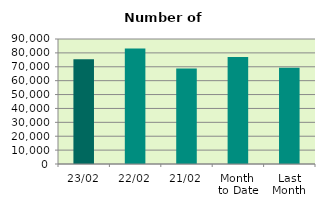
| Category | Series 0 |
|---|---|
| 23/02 | 75386 |
| 22/02 | 83152 |
| 21/02 | 68740 |
| Month 
to Date | 76987.294 |
| Last
Month | 69227.8 |